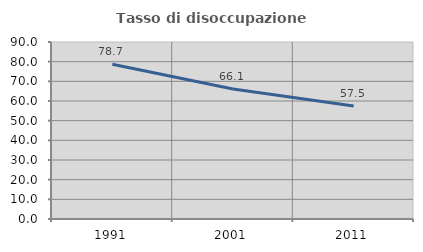
| Category | Tasso di disoccupazione giovanile  |
|---|---|
| 1991.0 | 78.659 |
| 2001.0 | 66.08 |
| 2011.0 | 57.451 |